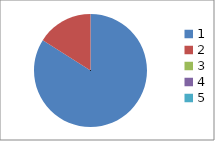
| Category | Series 0 |
|---|---|
| 0 | 0.84 |
| 1 | 0.16 |
| 2 | 0 |
| 3 | 0 |
| 4 | 0 |